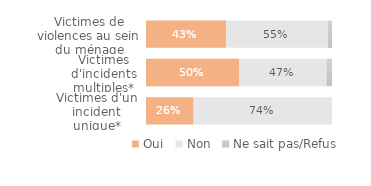
| Category | Oui | Non | Ne sait pas/Refus |
|---|---|---|---|
| Victimes d'un incident unique* | 0.256 | 0.744 | 0 |
| Victimes d'incidents multiples* | 0.502 | 0.468 | 0.03 |
| Victimes de violences au sein du ménage | 0.431 | 0.548 | 0.021 |